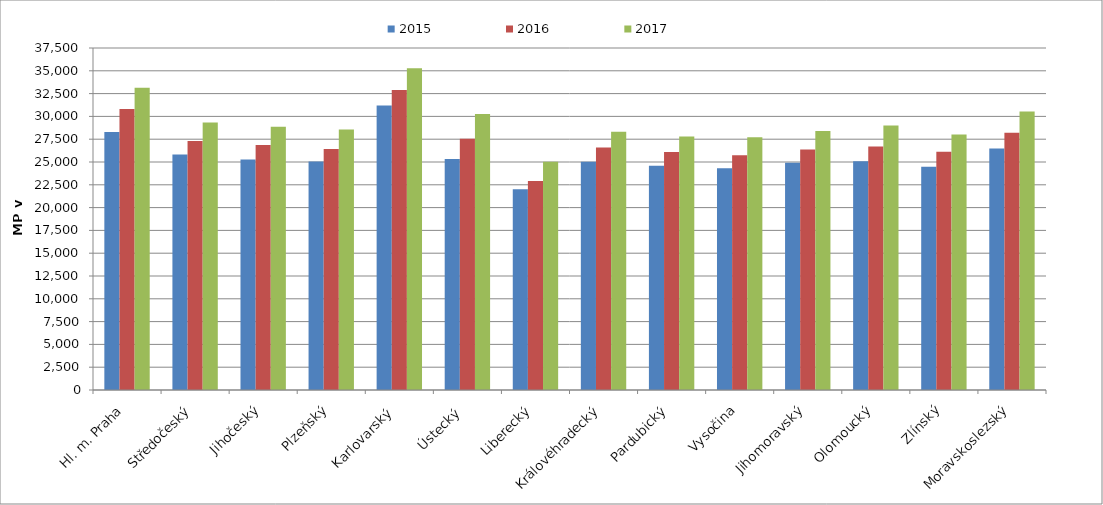
| Category | 2015 | 2016 | 2017 |
|---|---|---|---|
| Hl. m. Praha | 28299.906 | 30808.855 | 33148.1 |
| Středočeský | 25828.613 | 27299.916 | 29324.053 |
| Jihočeský | 25267.317 | 26854.909 | 28875.565 |
| Plzeňský | 25044.392 | 26434.608 | 28566.538 |
| Karlovarský  | 31200.436 | 32887.252 | 35274.309 |
| Ústecký   | 25326.157 | 27540.601 | 30270.99 |
| Liberecký | 22024.348 | 22921.266 | 25023.481 |
| Královéhradecký | 25029.455 | 26595.555 | 28311.877 |
| Pardubický | 24585.51 | 26088.948 | 27787.624 |
| Vysočina | 24314.353 | 25745.311 | 27710.594 |
| Jihomoravský | 24915.989 | 26378.006 | 28389.935 |
| Olomoucký | 25091.402 | 26704.857 | 28991.882 |
| Zlínský | 24471.815 | 26128.706 | 28015.681 |
| Moravskoslezský | 26473.744 | 28205.556 | 30538.227 |